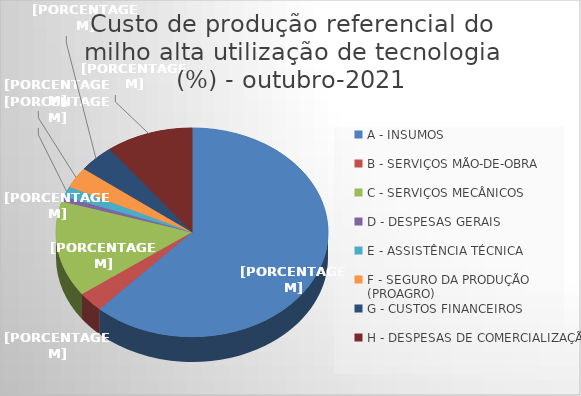
| Category | Series 0 |
|---|---|
| A - INSUMOS | 61.864 |
| B - SERVIÇOS MÃO-DE-OBRA | 3.09 |
| C - SERVIÇOS MECÂNICOS | 14.804 |
| D - DESPESAS GERAIS  | 0.798 |
| E - ASSISTÊNCIA TÉCNICA | 1.611 |
| F - SEGURO DA PRODUÇÃO (PROAGRO) | 3.222 |
| G - CUSTOS FINANCEIROS | 4.269 |
| H - DESPESAS DE COMERCIALIZAÇÃO | 10.341 |